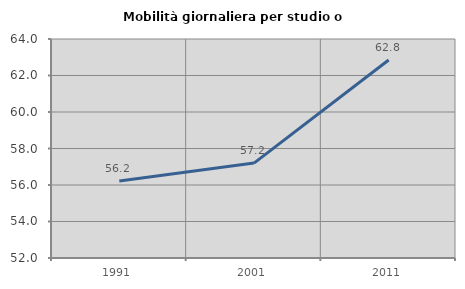
| Category | Mobilità giornaliera per studio o lavoro |
|---|---|
| 1991.0 | 56.218 |
| 2001.0 | 57.201 |
| 2011.0 | 62.848 |